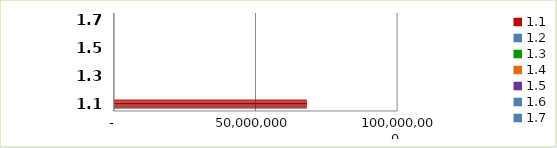
| Category | Series 0 |
|---|---|
| 1.1 | 68156641 |
| 1.2 | 0 |
| 1.3 | 0 |
| 1.4 | 0 |
| 1.5 | 0 |
| 1.6 | 0 |
| 1.7 | 0 |